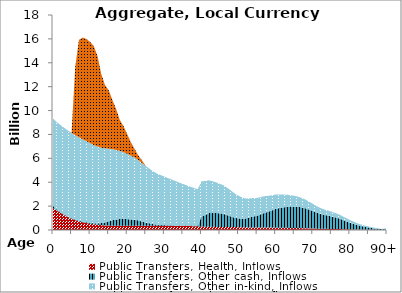
| Category | Public Transfers, Health, Inflows | Public Transfers, Other cash, Inflows | Public Transfers, Other in-kind, Inflows | Public Transfers, Education, Inflows |
|---|---|---|---|---|
| 0 | 1834.68 | 187.021 | 7312.346 | 0 |
|  | 1640.082 | 78.733 | 7312.594 | 0 |
| 2 | 1441.919 | 60.937 | 7294.868 | 0 |
| 3 | 1253.249 | 47.93 | 7260.562 | 0 |
| 4 | 1083.198 | 41.89 | 7211.066 | 0 |
| 5 | 941.736 | 41.097 | 7147.783 | 17.555 |
| 6 | 822.089 | 48.115 | 7072.1 | 5740.703 |
| 7 | 725.402 | 51.934 | 6985.417 | 8163.732 |
| 8 | 647.917 | 58.241 | 6889.124 | 8516.808 |
| 9 | 584.522 | 63.688 | 6784.621 | 8563.389 |
| 10 | 526.946 | 70.791 | 6672.246 | 8478.991 |
| 11 | 479.863 | 77.592 | 6552.356 | 8282.978 |
| 12 | 441.256 | 109.996 | 6431.578 | 7574.779 |
| 13 | 408.738 | 167.981 | 6313.408 | 6170.688 |
| 14 | 385.619 | 253.023 | 6196.094 | 5312.429 |
| 15 | 370.037 | 360.776 | 6073.603 | 4903.487 |
| 16 | 359.704 | 464.633 | 5946.205 | 4119.166 |
| 17 | 356.289 | 520.647 | 5820.953 | 3444.129 |
| 18 | 358.255 | 562.355 | 5700.477 | 2591.502 |
| 19 | 358.87 | 581.378 | 5581.707 | 2176.894 |
| 20 | 361.407 | 551.508 | 5461.104 | 1639.937 |
| 21 | 361.853 | 514.638 | 5341.912 | 1124.194 |
| 22 | 361.617 | 499.412 | 5209.942 | 706.637 |
| 23 | 358.659 | 440.249 | 5058.587 | 381.018 |
| 24 | 356.214 | 345.103 | 4895.784 | 220.744 |
| 25 | 353.781 | 273.644 | 4735.19 | 2.124 |
| 26 | 352.067 | 209.653 | 4573.013 | 2.331 |
| 27 | 349.035 | 137.479 | 4423.488 | 0 |
| 28 | 347.87 | 91.599 | 4294.755 | 0 |
| 29 | 348.884 | 76.495 | 4179.914 | 0 |
| 30 | 346.956 | 62.229 | 4064.218 | 0 |
| 31 | 346.351 | 47.398 | 3950.955 | 0 |
| 32 | 344.917 | 42.635 | 3836.409 | 0 |
| 33 | 342.639 | 42.04 | 3717.351 | 0 |
| 34 | 336.663 | 42.319 | 3596.414 | 0 |
| 35 | 335.771 | 44.957 | 3479.041 | 0 |
| 36 | 331.544 | 49.606 | 3363.69 | 0 |
| 37 | 326.335 | 52.733 | 3252.799 | 0 |
| 38 | 316.139 | 55.724 | 3147.972 | 0 |
| 39 | 306.978 | 58.205 | 3047.507 | 0 |
| 40 | 292.56 | 831.742 | 2947.245 | 0 |
| 41 | 279.637 | 974.169 | 2847.005 | 0 |
| 42 | 269.439 | 1143.639 | 2749.347 | 0 |
| 43 | 263.927 | 1159.43 | 2654.8 | 0 |
| 44 | 260.502 | 1163.901 | 2561.609 | 0 |
| 45 | 260.433 | 1139.135 | 2470.274 | 0 |
| 46 | 260.596 | 1088.505 | 2384.006 | 0 |
| 47 | 257.885 | 976.937 | 2284.446 | 0 |
| 48 | 253.59 | 873.662 | 2163.555 | 0 |
| 49 | 245.55 | 776.477 | 2031.309 | 0 |
| 50 | 236.817 | 732.02 | 1903.543 | 0 |
| 51 | 227.371 | 712.899 | 1774.555 | 0 |
| 52 | 220.215 | 747.615 | 1667.891 | 0 |
| 53 | 216.965 | 835.237 | 1596.061 | 0 |
| 54 | 217.69 | 915.939 | 1547.183 | 0 |
| 55 | 217.714 | 970.403 | 1497.152 | 0 |
| 56 | 217.687 | 1097.569 | 1451.079 | 0 |
| 57 | 216.23 | 1214.81 | 1399.891 | 0 |
| 58 | 211.733 | 1316.181 | 1336.754 | 0 |
| 59 | 205.037 | 1433.078 | 1266.629 | 0 |
| 60 | 198.37 | 1571.392 | 1201.091 | 0 |
| 61 | 191.998 | 1644.684 | 1137.485 | 0 |
| 62 | 185.765 | 1706.326 | 1076.338 | 0 |
| 63 | 179.96 | 1753.929 | 1018.944 | 0 |
| 64 | 174.199 | 1787.736 | 963.999 | 0 |
| 65 | 168.275 | 1786.087 | 909.814 | 0 |
| 66 | 162.398 | 1775.917 | 857.932 | 0 |
| 67 | 155.456 | 1739.311 | 802.255 | 0 |
| 68 | 146.726 | 1670.221 | 739.984 | 0 |
| 69 | 136.917 | 1565.659 | 674.621 | 0 |
| 70 | 126.495 | 1462.379 | 611.586 | 0 |
| 71 | 115.464 | 1349.429 | 548.66 | 0 |
| 72 | 105.813 | 1250.738 | 495.198 | 0 |
| 73 | 98.813 | 1173.637 | 456.015 | 0 |
| 74 | 93.655 | 1118.357 | 426.343 | 0 |
| 75 | 88.813 | 1050.912 | 397.094 | 0 |
| 76 | 83.806 | 979.915 | 370.747 | 0 |
| 77 | 77.473 | 892.58 | 340.915 | 0 |
| 78 | 69.022 | 788.117 | 303.725 | 0 |
| 79 | 59.692 | 670.516 | 262.668 | 0 |
| 80 | 51.135 | 563.754 | 225.015 | 0 |
| 81 | 43.011 | 463.749 | 189.266 | 0 |
| 82 | 35.782 | 375.585 | 157.455 | 0 |
| 83 | 29.85 | 302.993 | 131.352 | 0 |
| 84 | 24.923 | 243.117 | 109.672 | 0 |
| 85 | 20.277 | 188.898 | 89.229 | 0 |
| 86 | 16.005 | 141.429 | 70.43 | 0 |
| 87 | 12.376 | 103.603 | 54.458 | 0 |
| 88 | 9.431 | 75.851 | 41.501 | 0 |
| 89 | 7.073 | 54.392 | 31.123 | 0 |
| 90+ | 14.589 | 107.054 | 64.196 | 0 |